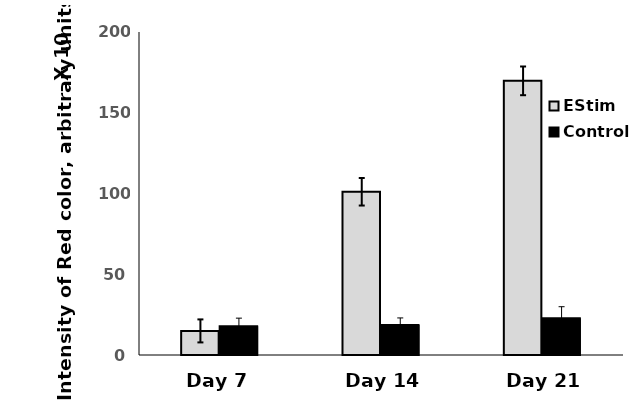
| Category | EStim | Control |
|---|---|---|
| Day 7 | 14918 | 17869.333 |
| Day 14 | 101073.333 | 18646.667 |
| Day 21 | 169753 | 22744.667 |